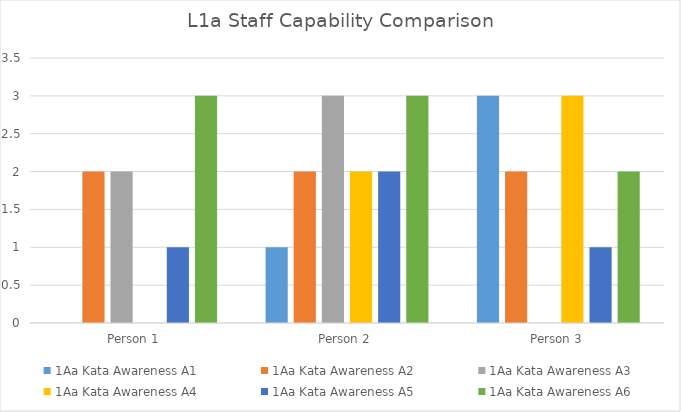
| Category | 1Aa Kata Awareness |
|---|---|
| Person 1 | 3 |
| Person 2 | 3 |
| Person 3 | 2 |